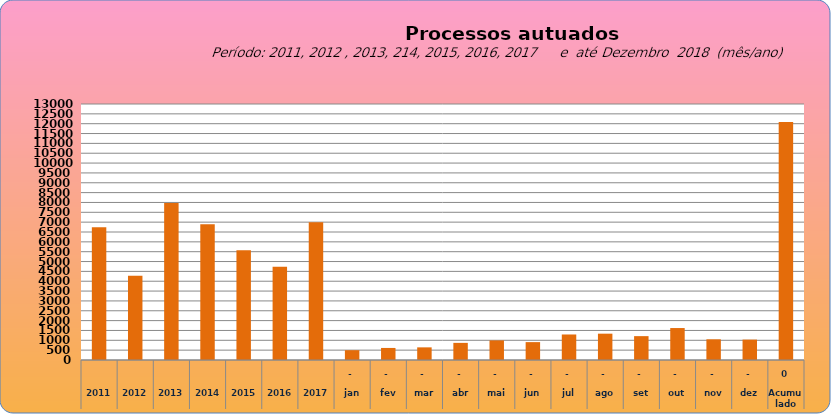
| Category | 6735 |
|---|---|
| 2011 | 6735 |
| 2012 | 4276 |
| 2013 | 7967 |
| 2014 | 6893 |
| 2015 | 5569 |
| 2016 | 4737 |
| 2017 | 6997 |
| jan | 498 |
| fev | 612 |
| mar | 642 |
| abr | 870 |
| mai | 995 |
| jun | 908 |
| jul | 1296 |
| ago | 1337 |
| set | 1212 |
| out | 1623 |
| nov | 1051 |
| dez | 1036 |
| Acumulado
 | 12080 |